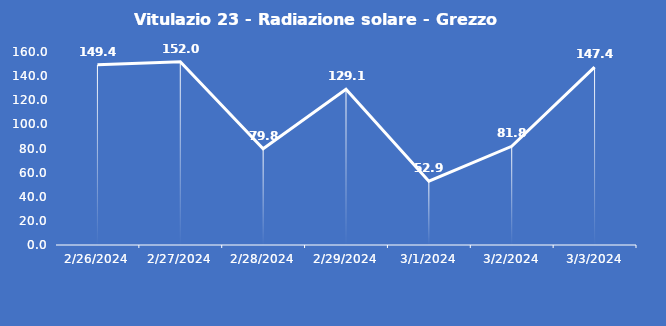
| Category | Vitulazio 23 - Radiazione solare - Grezzo (W/m2) |
|---|---|
| 2/26/24 | 149.4 |
| 2/27/24 | 152 |
| 2/28/24 | 79.8 |
| 2/29/24 | 129.1 |
| 3/1/24 | 52.9 |
| 3/2/24 | 81.8 |
| 3/3/24 | 147.4 |